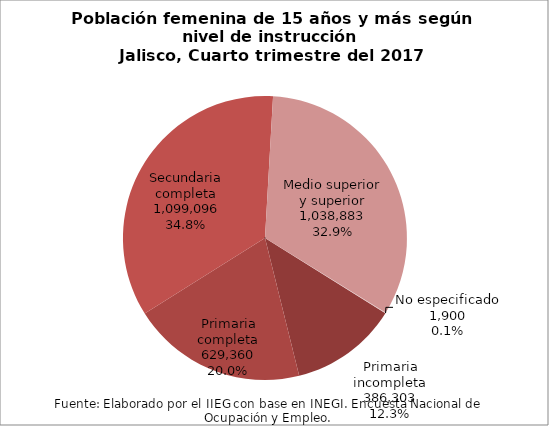
| Category | Series 0 |
|---|---|
| Primaria incompleta | 386303 |
| Primaria completa | 629360 |
| Secundaria completa | 1099096 |
| Medio superior y superior | 1038883 |
| No especificado | 1900 |